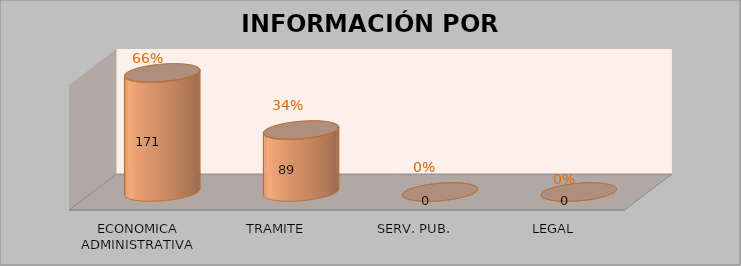
| Category | Series 0 | Series 1 | Series 2 | Series 3 |
|---|---|---|---|---|
| ECONOMICA ADMINISTRATIVA |  |  | 171 | 0.658 |
| TRAMITE |  |  | 89 | 0.342 |
| SERV. PUB. |  |  | 0 | 0 |
| LEGAL |  |  | 0 | 0 |